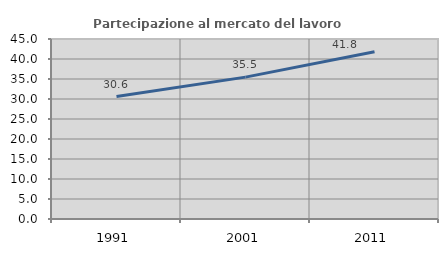
| Category | Partecipazione al mercato del lavoro  femminile |
|---|---|
| 1991.0 | 30.625 |
| 2001.0 | 35.473 |
| 2011.0 | 41.832 |